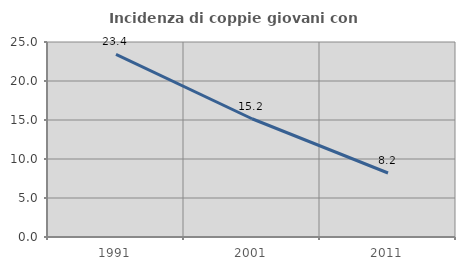
| Category | Incidenza di coppie giovani con figli |
|---|---|
| 1991.0 | 23.413 |
| 2001.0 | 15.16 |
| 2011.0 | 8.204 |